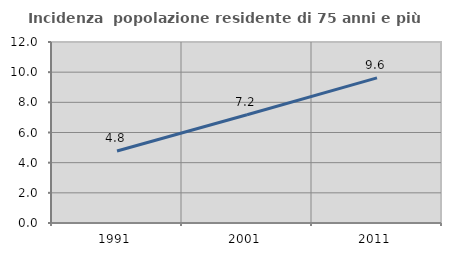
| Category | Incidenza  popolazione residente di 75 anni e più |
|---|---|
| 1991.0 | 4.769 |
| 2001.0 | 7.173 |
| 2011.0 | 9.624 |